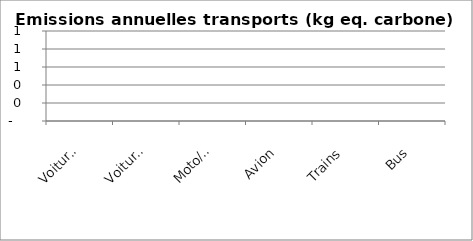
| Category | kg eq C |
|---|---|
| Voiture ess. | 0 |
| Voiture gaz | 0 |
| Moto/Scooter/Mobilette | 0 |
| Avion | 0 |
| Trains | 0 |
| Bus | 0 |